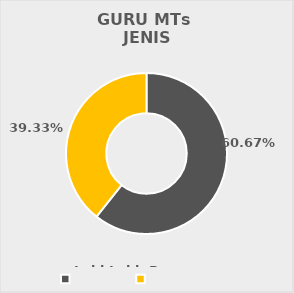
| Category | GURU MTs 
JENIS KELAMIN |
|---|---|
| Laki-Laki | 1473 |
| Perempuan | 955 |